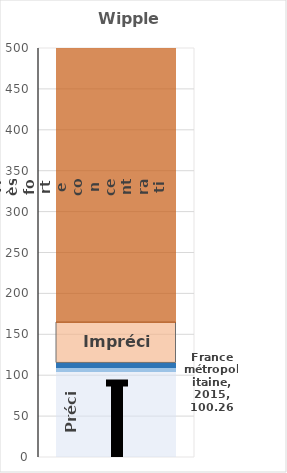
| Category | Précis | Assez précises | Plutôt satisfaisantes | Imprécis | Très forte concentration |
|---|---|---|---|---|---|
| 0 | 105 | 5 | 5 | 50 | 335 |